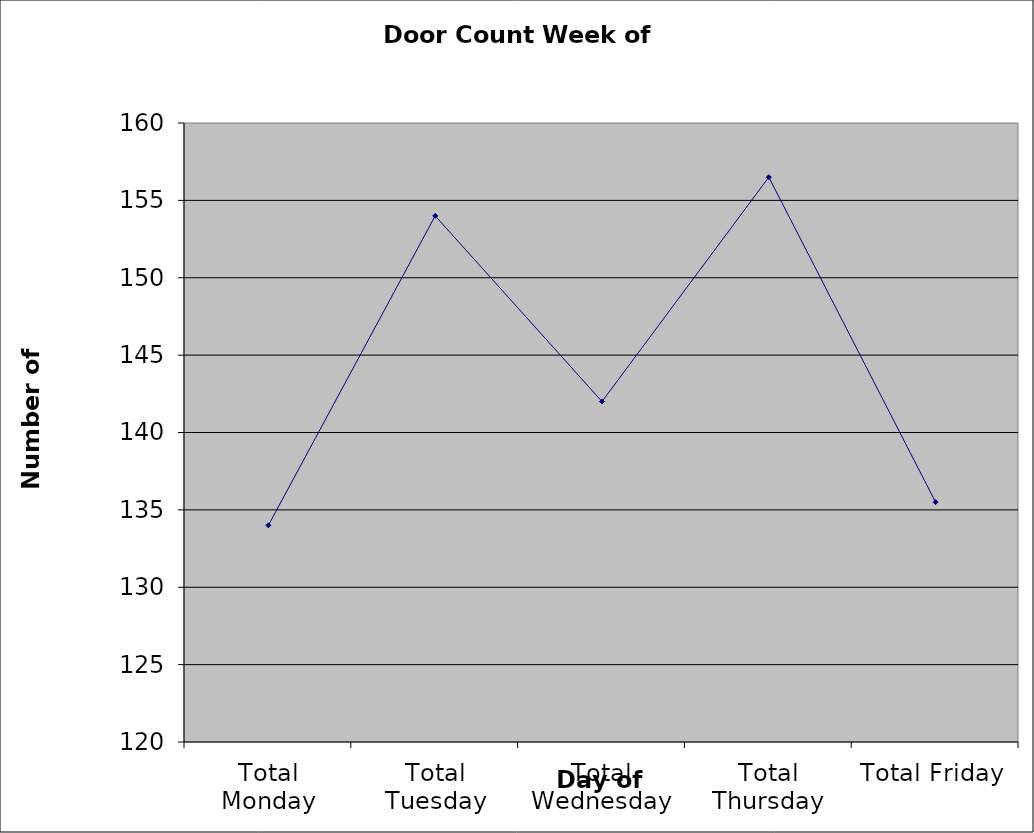
| Category | Series 0 |
|---|---|
| Total Monday | 134 |
| Total Tuesday | 154 |
| Total Wednesday | 142 |
| Total Thursday | 156.5 |
| Total Friday | 135.5 |